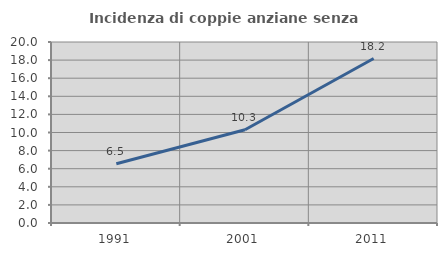
| Category | Incidenza di coppie anziane senza figli  |
|---|---|
| 1991.0 | 6.54 |
| 2001.0 | 10.299 |
| 2011.0 | 18.174 |